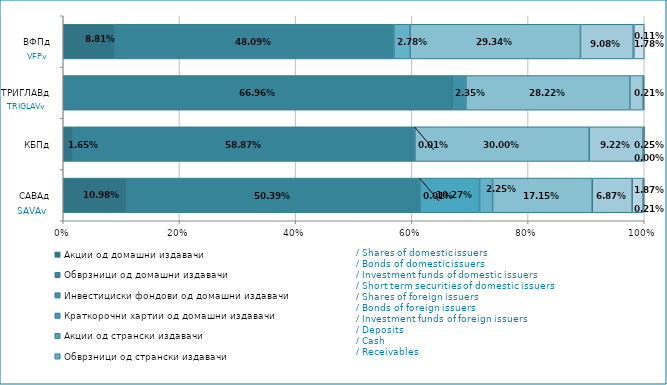
| Category | Акции од домашни издавачи  | Обврзници од домашни издавачи  | Инвестициски фондови од домашни издавачи   | Краткорочни хартии од домашни издавачи   | Акции од странски издавачи   | Обврзници од странски издавачи  | Инвестициски фондови од странски издавчи  | Депозити | Парични средства | Побарувања |
|---|---|---|---|---|---|---|---|---|---|---|
| САВАд | 0.11 | 0.504 | 0 | 0 | 0.103 | 0.022 | 0.171 | 0.069 | 0.019 | 0.002 |
| КБПд | 0.017 | 0.589 | 0 | 0 | 0 | 0 | 0.3 | 0.092 | 0.003 | 0 |
| ТРИГЛАВд | 0 | 0.67 | 0.023 | 0 | 0 | 0 | 0.282 | 0.023 | 0.002 | 0 |
| ВФПд | 0.088 | 0.481 | 0 | 0 | 0 | 0.028 | 0.293 | 0.091 | 0.001 | 0.018 |